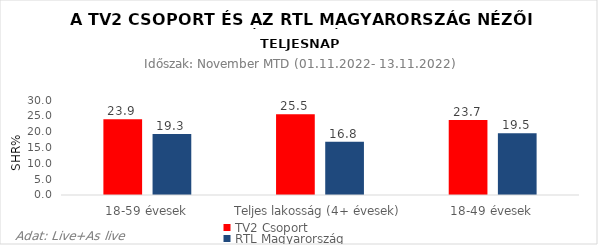
| Category | TV2 Csoport | RTL Magyarország |
|---|---|---|
| 18-59 évesek | 23.9 | 19.3 |
| Teljes lakosság (4+ évesek) | 25.5 | 16.8 |
| 18-49 évesek | 23.7 | 19.5 |